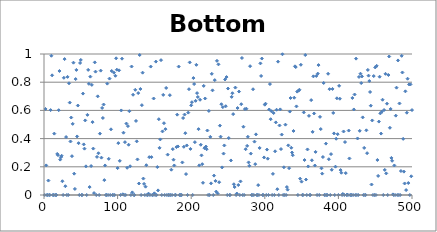
| Category | Bottom Slice |
|---|---|
| 0 | 0 |
| 1 | 0.61 |
| 2 | 0.21 |
| 3 | 0 |
| 4 | 0 |
| 5 | 0.102 |
| 6 | 0 |
| 7 | 0 |
| 8 | 0.602 |
| 9 | 0.988 |
| 10 | 0.849 |
| 11 | 0 |
| 12 | 0 |
| 13 | 0.435 |
| 14 | 0 |
| 15 | 0 |
| 16 | 0 |
| 17 | 0.291 |
| 18 | 0.283 |
| 19 | 0.601 |
| 20 | 0.879 |
| 21 | 0.251 |
| 22 | 0.268 |
| 23 | 0.278 |
| 24 | 0.098 |
| 25 | 0 |
| 26 | 0.831 |
| 27 | 0.964 |
| 28 | 0.062 |
| 29 | 0.411 |
| 30 | 0 |
| 31 | 0.838 |
| 32 | 0 |
| 33 | 0.792 |
| 34 | 0.655 |
| 35 | 0.379 |
| 36 | 0.549 |
| 37 | 0.275 |
| 38 | 0.504 |
| 39 | 0.938 |
| 40 | 0.151 |
| 41 | 0.043 |
| 42 | 0.822 |
| 43 | 0.887 |
| 44 | 0.415 |
| 45 | 0.634 |
| 46 | 0.368 |
| 47 | 0 |
| 48 | 0.936 |
| 49 | 0.958 |
| 50 | 0 |
| 51 | 0 |
| 52 | 0.719 |
| 53 | 0.359 |
| 54 | 0.329 |
| 55 | 0.529 |
| 56 | 0.203 |
| 57 | 0 |
| 58 | 0.568 |
| 59 | 0.887 |
| 60 | 0.788 |
| 61 | 0.056 |
| 62 | 0.84 |
| 63 | 0.205 |
| 64 | 0.781 |
| 65 | 0.517 |
| 66 | 0.329 |
| 67 | 0.014 |
| 68 | 0.941 |
| 69 | 0.875 |
| 70 | 0 |
| 71 | 0.27 |
| 72 | 0.7 |
| 73 | 0.296 |
| 74 | 0 |
| 75 | 0.435 |
| 76 | 0.882 |
| 77 | 0.265 |
| 78 | 0.618 |
| 79 | 0.546 |
| 80 | 0.642 |
| 81 | 0.106 |
| 82 | 0.21 |
| 83 | 0 |
| 84 | 0 |
| 85 | 0.79 |
| 86 | 0 |
| 87 | 0.257 |
| 88 | 0.825 |
| 89 | 0 |
| 90 | 0.466 |
| 91 | 0.88 |
| 92 | 0 |
| 93 | 0 |
| 94 | 0.868 |
| 95 | 0 |
| 96 | 0.845 |
| 97 | 0.969 |
| 98 | 0.889 |
| 99 | 0.191 |
| 100 | 0.368 |
| 101 | 0.884 |
| 102 | 0.242 |
| 103 | 0 |
| 104 | 0.6 |
| 105 | 0.967 |
| 106 | 0.005 |
| 107 | 0.442 |
| 108 | 0 |
| 109 | 0.375 |
| 110 | 0 |
| 111 | 0.507 |
| 112 | 0.193 |
| 113 | 0.489 |
| 114 | 0.357 |
| 115 | 0.594 |
| 116 | 0.204 |
| 117 | 0 |
| 118 | 0.911 |
| 119 | 0.019 |
| 120 | 0.711 |
| 121 | 0 |
| 122 | 0 |
| 123 | 0.746 |
| 124 | 0.525 |
| 125 | 0.381 |
| 126 | 0.252 |
| 127 | 0.723 |
| 128 | 0.082 |
| 129 | 0.993 |
| 130 | 0.752 |
| 131 | 0 |
| 132 | 0.637 |
| 133 | 0.868 |
| 134 | 0.116 |
| 135 | 0.079 |
| 136 | 0 |
| 137 | 0.059 |
| 138 | 0.211 |
| 139 | 0 |
| 140 | 0 |
| 141 | 0.01 |
| 142 | 0.268 |
| 143 | 0 |
| 144 | 0.911 |
| 145 | 0.269 |
| 146 | 0 |
| 147 | 0 |
| 148 | 0.684 |
| 149 | 0.012 |
| 150 | 0 |
| 151 | 0.946 |
| 152 | 0 |
| 153 | 0.198 |
| 154 | 0.033 |
| 155 | 0.538 |
| 156 | 0.334 |
| 157 | 0.394 |
| 158 | 0.956 |
| 159 | 0 |
| 160 | 0.451 |
| 161 | 0.71 |
| 162 | 0.509 |
| 163 | 0 |
| 164 | 0.467 |
| 165 | 0.759 |
| 166 | 0 |
| 167 | 0.286 |
| 168 | 0 |
| 169 | 0 |
| 170 | 0.708 |
| 171 | 0 |
| 172 | 0.179 |
| 173 | 0 |
| 174 | 0.325 |
| 175 | 0.25 |
| 176 | 0.209 |
| 177 | 0 |
| 178 | 0 |
| 179 | 0.34 |
| 180 | 0.57 |
| 181 | 0.344 |
| 182 | 0.911 |
| 183 | 0 |
| 184 | 0 |
| 185 | 0 |
| 186 | 0 |
| 187 | 0.231 |
| 188 | 0.546 |
| 189 | 0.342 |
| 190 | 0.57 |
| 191 | 0.438 |
| 192 | 0.149 |
| 193 | 0.351 |
| 194 | 0 |
| 195 | 0.584 |
| 196 | 0.75 |
| 197 | 0.94 |
| 198 | 0.327 |
| 199 | 0.636 |
| 200 | 0.658 |
| 201 | 0 |
| 202 | 0.829 |
| 203 | 0.787 |
| 204 | 0.375 |
| 205 | 0.668 |
| 206 | 0.923 |
| 207 | 0.723 |
| 208 | 0.695 |
| 209 | 0.467 |
| 210 | 0.21 |
| 211 | 0.675 |
| 212 | 0.356 |
| 213 | 0.281 |
| 214 | 0.219 |
| 215 | 0.087 |
| 216 | 0.774 |
| 217 | 0.332 |
| 218 | 0.684 |
| 219 | 0.344 |
| 220 | 0.325 |
| 221 | 0.457 |
| 222 | 0 |
| 223 | 0.596 |
| 224 | 0 |
| 225 | 0.412 |
| 226 | 0.083 |
| 227 | 0.859 |
| 228 | 0.742 |
| 229 | 0 |
| 230 | 0.137 |
| 231 | 0.815 |
| 232 | 0.1 |
| 233 | 0.024 |
| 234 | 0.951 |
| 235 | 0.01 |
| 236 | 0.927 |
| 237 | 0.091 |
| 238 | 0.492 |
| 239 | 0.414 |
| 240 | 0.644 |
| 241 | 0.196 |
| 242 | 0.623 |
| 243 | 0.294 |
| 244 | 0.351 |
| 245 | 0.819 |
| 246 | 0.63 |
| 247 | 0.837 |
| 248 | 0 |
| 249 | 0.755 |
| 250 | 0.404 |
| 251 | 0 |
| 252 | 0 |
| 253 | 0.245 |
| 254 | 0.696 |
| 255 | 0.722 |
| 256 | 0.574 |
| 257 | 0.076 |
| 258 | 0.056 |
| 259 | 0.762 |
| 260 | 0 |
| 261 | 0.01 |
| 262 | 0.617 |
| 263 | 0.071 |
| 264 | 0.734 |
| 265 | 0 |
| 266 | 0.096 |
| 267 | 0.644 |
| 268 | 0.972 |
| 269 | 0 |
| 270 | 0.484 |
| 271 | 0 |
| 272 | 0.61 |
| 273 | 0.325 |
| 274 | 0.612 |
| 275 | 0.348 |
| 276 | 0.413 |
| 277 | 0.231 |
| 278 | 0.207 |
| 279 | 0.914 |
| 280 | 0.294 |
| 281 | 0 |
| 282 | 0 |
| 283 | 0.75 |
| 284 | 0 |
| 285 | 0.379 |
| 286 | 0.219 |
| 287 | 0.43 |
| 288 | 0 |
| 289 | 0 |
| 290 | 0.07 |
| 291 | 0 |
| 292 | 0.334 |
| 293 | 0.933 |
| 294 | 0.844 |
| 295 | 0.968 |
| 296 | 0 |
| 297 | 0 |
| 298 | 0.267 |
| 299 | 0.64 |
| 300 | 0.648 |
| 301 | 0 |
| 302 | 0.322 |
| 303 | 0.258 |
| 304 | 0 |
| 305 | 0.606 |
| 306 | 0.787 |
| 307 | 0.537 |
| 308 | 0.594 |
| 309 | 0 |
| 310 | 0.15 |
| 311 | 0.581 |
| 312 | 0 |
| 313 | 0.31 |
| 314 | 0.515 |
| 315 | 0.605 |
| 316 | 0.041 |
| 317 | 0.946 |
| 318 | 0 |
| 319 | 0.493 |
| 320 | 0.607 |
| 321 | 0.326 |
| 322 | 0.429 |
| 323 | 0.998 |
| 324 | 0 |
| 325 | 0.196 |
| 326 | 0 |
| 327 | 0.499 |
| 328 | 0 |
| 329 | 0.056 |
| 330 | 0.038 |
| 331 | 0.352 |
| 332 | 0.19 |
| 333 | 0.592 |
| 334 | 0.688 |
| 335 | 0.335 |
| 336 | 0.301 |
| 337 | 0.282 |
| 338 | 0.454 |
| 339 | 0.69 |
| 340 | 0.913 |
| 341 | 0.907 |
| 342 | 0.628 |
| 343 | 0.733 |
| 344 | 0 |
| 345 | 0.74 |
| 346 | 0.747 |
| 347 | 0.116 |
| 348 | 0.923 |
| 349 | 0.095 |
| 350 | 0 |
| 351 | 0 |
| 352 | 0.586 |
| 353 | 0.248 |
| 354 | 0.993 |
| 355 | 0.11 |
| 356 | 0 |
| 357 | 0.323 |
| 358 | 0.203 |
| 359 | 0.561 |
| 360 | 0 |
| 361 | 0 |
| 362 | 0.673 |
| 363 | 0.246 |
| 364 | 0.448 |
| 365 | 0.841 |
| 366 | 0.578 |
| 367 | 0.209 |
| 368 | 0.306 |
| 369 | 0.844 |
| 370 | 0 |
| 371 | 0.861 |
| 372 | 0.921 |
| 373 | 0 |
| 374 | 0.554 |
| 375 | 0.468 |
| 376 | 0.189 |
| 377 | 0.152 |
| 378 | 0.269 |
| 379 | 0.795 |
| 380 | 0 |
| 381 | 0 |
| 382 | 0.364 |
| 383 | 0 |
| 384 | 0 |
| 385 | 0.86 |
| 386 | 0.254 |
| 387 | 0.751 |
| 388 | 0 |
| 389 | 0.29 |
| 390 | 0.179 |
| 391 | 0.752 |
| 392 | 0.582 |
| 393 | 0.437 |
| 394 | 0 |
| 395 | 0.201 |
| 396 | 0.399 |
| 397 | 0.686 |
| 398 | 0.431 |
| 399 | 0 |
| 400 | 0.774 |
| 401 | 0.683 |
| 402 | 0.177 |
| 403 | 0.158 |
| 404 | 0 |
| 405 | 0.007 |
| 406 | 0.45 |
| 407 | 0 |
| 408 | 0.376 |
| 409 | 0.155 |
| 410 | 0 |
| 411 | 0.002 |
| 412 | 0 |
| 413 | 0.457 |
| 414 | 0.259 |
| 415 | 0 |
| 416 | 0 |
| 417 | 0 |
| 418 | 0.688 |
| 419 | 0 |
| 420 | 0.607 |
| 421 | 0.713 |
| 422 | 0 |
| 423 | 0.967 |
| 424 | 0 |
| 425 | 0.401 |
| 426 | 0 |
| 427 | 0.837 |
| 428 | 0.455 |
| 429 | 0.86 |
| 430 | 0.794 |
| 431 | 0.841 |
| 432 | 0.55 |
| 433 | 0 |
| 434 | 0.334 |
| 435 | 0 |
| 436 | 0 |
| 437 | 0.459 |
| 438 | 0.297 |
| 439 | 0.887 |
| 440 | 0.847 |
| 441 | 0.808 |
| 442 | 0.731 |
| 443 | 0.633 |
| 444 | 0.074 |
| 445 | 0.529 |
| 446 | 0 |
| 447 | 0.844 |
| 448 | 0 |
| 449 | 0.905 |
| 450 | 0 |
| 451 | 0.916 |
| 452 | 0.248 |
| 453 | 0.135 |
| 454 | 0.521 |
| 455 | 0.839 |
| 456 | 0.579 |
| 457 | 0.436 |
| 458 | 0.59 |
| 459 | 0.676 |
| 460 | 0 |
| 461 | 0.603 |
| 462 | 0.178 |
| 463 | 0.859 |
| 464 | 0.153 |
| 465 | 0.648 |
| 466 | 0 |
| 467 | 0.851 |
| 468 | 0.982 |
| 469 | 0.477 |
| 470 | 0.61 |
| 471 | 0.263 |
| 472 | 0.243 |
| 473 | 0.004 |
| 474 | 0 |
| 475 | 0.21 |
| 476 | 0 |
| 477 | 0.563 |
| 478 | 0.761 |
| 479 | 0 |
| 480 | 0.954 |
| 481 | 0 |
| 482 | 0.649 |
| 483 | 0 |
| 484 | 0.17 |
| 485 | 0.987 |
| 486 | 0.869 |
| 487 | 0.398 |
| 488 | 0.166 |
| 489 | 0.082 |
| 490 | 0.735 |
| 491 | 0.035 |
| 492 | 0.584 |
| 493 | 0.825 |
| 494 | 0.085 |
| 495 | 0.784 |
| 496 | 0 |
| 497 | 0.785 |
| 498 | 0.133 |
| 499 | 0.602 |